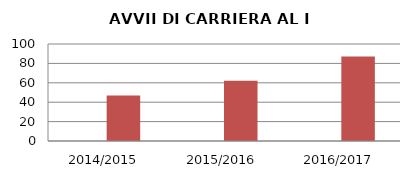
| Category | ANNO | NUMERO |
|---|---|---|
| 2014/2015 | 0 | 47 |
| 2015/2016 | 0 | 62 |
| 2016/2017 | 0 | 87 |